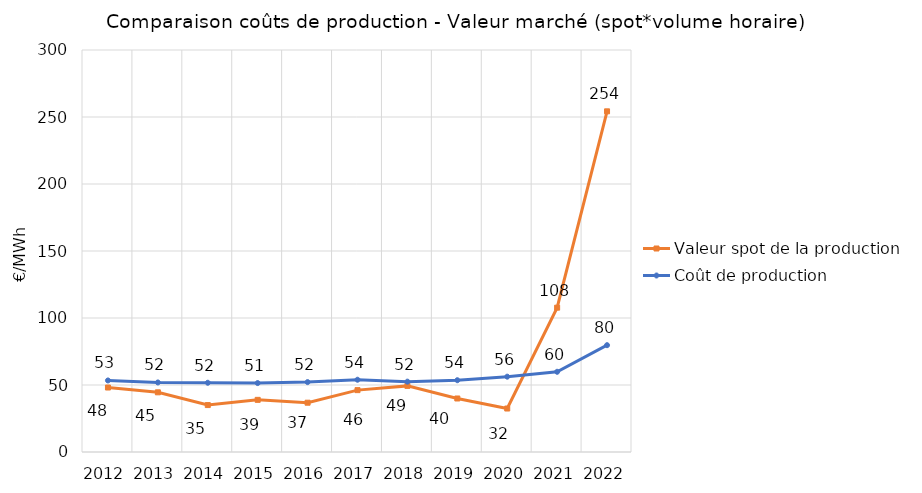
| Category | Valeur spot de la production | Coût de production |
|---|---|---|
| 2012.0 | 48.118 | 53.387 |
| 2013.0 | 44.533 | 51.896 |
| 2014.0 | 35.026 | 51.672 |
| 2015.0 | 38.919 | 51.444 |
| 2016.0 | 36.788 | 52.155 |
| 2017.0 | 46.172 | 53.934 |
| 2018.0 | 49.337 | 52.5 |
| 2019.0 | 39.928 | 53.567 |
| 2020.0 | 32.449 | 56.211 |
| 2021.0 | 107.71 | 59.864 |
| 2022.0 | 254.23 | 79.715 |